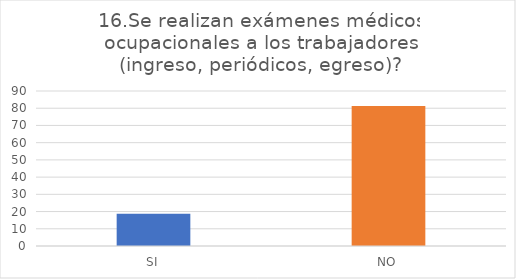
| Category | Se realizan exámenes médicos ocupacionales a los trabajadores (ingreso, periódicos, egreso)? |
|---|---|
| SI | 18.75 |
| NO | 81.25 |